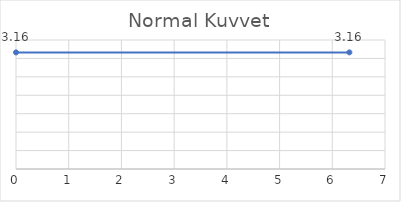
| Category | Series 0 |
|---|---|
| 0.0 | 3.164 |
| 6.324555320336759 | 3.164 |